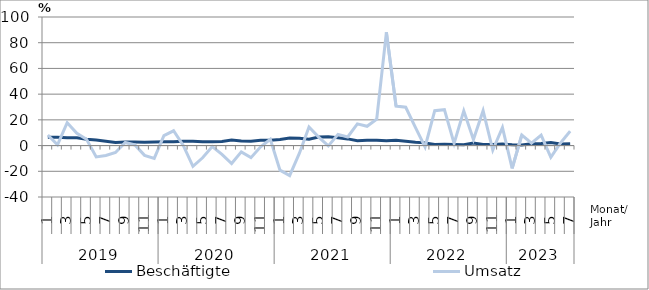
| Category | Beschäftigte | Umsatz |
|---|---|---|
| 0 | 6.4 | 8.2 |
| 1 | 6.5 | 0.6 |
| 2 | 6 | 17.8 |
| 3 | 6.1 | 9.6 |
| 4 | 4.9 | 4.9 |
| 5 | 4.3 | -8.8 |
| 6 | 3.3 | -7.7 |
| 7 | 2.4 | -5.4 |
| 8 | 2.8 | 2.4 |
| 9 | 2.7 | 0.5 |
| 10 | 2.5 | -7.6 |
| 11 | 2.7 | -10 |
| 12 | 2.9 | 7.8 |
| 13 | 2.9 | 11.5 |
| 14 | 3.4 | 0.1 |
| 15 | 3.4 | -16.1 |
| 16 | 2.9 | -9.5 |
| 17 | 2.9 | -0.8 |
| 18 | 3.1 | -6.9 |
| 19 | 4.3 | -14 |
| 20 | 3.6 | -4.9 |
| 21 | 3.4 | -9.4 |
| 22 | 4.1 | -0.9 |
| 23 | 4.1 | 4.9 |
| 24 | 4.8 | -19.1 |
| 25 | 5.8 | -23.3 |
| 26 | 5.6 | -6.1 |
| 27 | 5 | 14.4 |
| 28 | 6.6 | 6.6 |
| 29 | 6.9 | -0.3 |
| 30 | 6 | 8.7 |
| 31 | 5.2 | 6.7 |
| 32 | 3.8 | 16.9 |
| 33 | 4.2 | 15 |
| 34 | 4.2 | 20.6 |
| 35 | 3.7 | 88.1 |
| 36 | 4.1 | 30.7 |
| 37 | 3.4 | 29.8 |
| 38 | 2.6 | 14.1 |
| 39 | 2.1 | -1.1 |
| 40 | 0.9 | 27.1 |
| 41 | 1 | 27.9 |
| 42 | 0.8 | 1.7 |
| 43 | 0.7 | 27 |
| 44 | 2 | 4.7 |
| 45 | 0.9 | 27.1 |
| 46 | 0.9 | -3.5 |
| 47 | 1.2 | 14.1 |
| 48 | 0.6 | -17.8 |
| 49 | 0.5 | 8.2 |
| 50 | 1.4 | 1.9 |
| 51 | 1.7 | 8.1 |
| 52 | 2.3 | -9.1 |
| 53 | 1.2 | 2 |
| 54 | 1.4 | 11.2 |